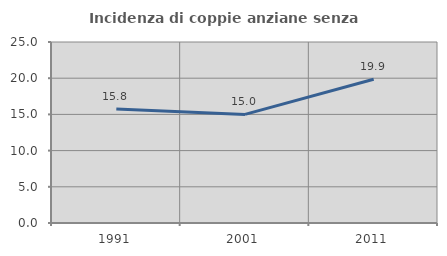
| Category | Incidenza di coppie anziane senza figli  |
|---|---|
| 1991.0 | 15.762 |
| 2001.0 | 15 |
| 2011.0 | 19.851 |